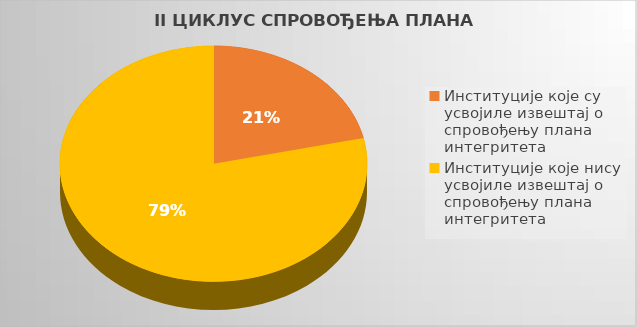
| Category | Series 0 |
|---|---|
| Институције које су усвојиле извештај о спровођењу плана интегритета | 0.215 |
| Институције које нису усвојиле извештај о спровођењу плана интегритета | 0.785 |